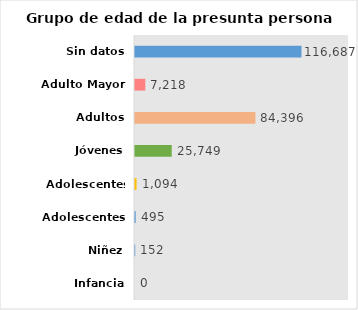
| Category | Series 0 |
|---|---|
| Infancia | 0 |
| Niñez | 152 |
| Adolescentes | 495 |
| Adolescentes tardios | 1094 |
| Jóvenes | 25749 |
| Adultos | 84396 |
| Adulto Mayor | 7218 |
| Sin datos | 116687 |